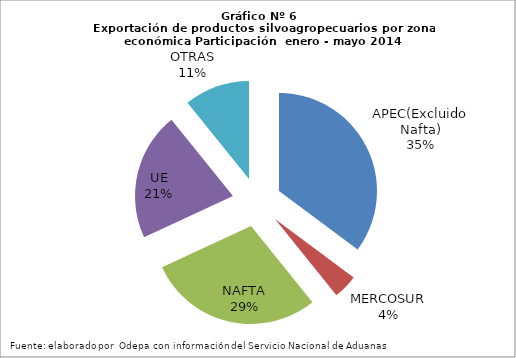
| Category | Series 0 |
|---|---|
| APEC(Excluido Nafta) | 2508805.112 |
| MERCOSUR | 288331.234 |
| NAFTA | 2059811.163 |
| UE | 1504926.564 |
| OTRAS | 770657.927 |